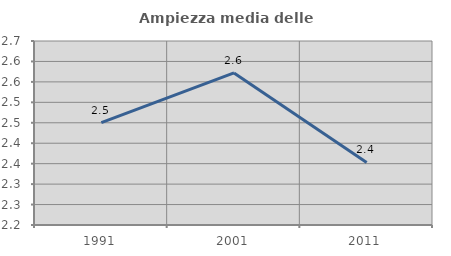
| Category | Ampiezza media delle famiglie |
|---|---|
| 1991.0 | 2.45 |
| 2001.0 | 2.572 |
| 2011.0 | 2.353 |